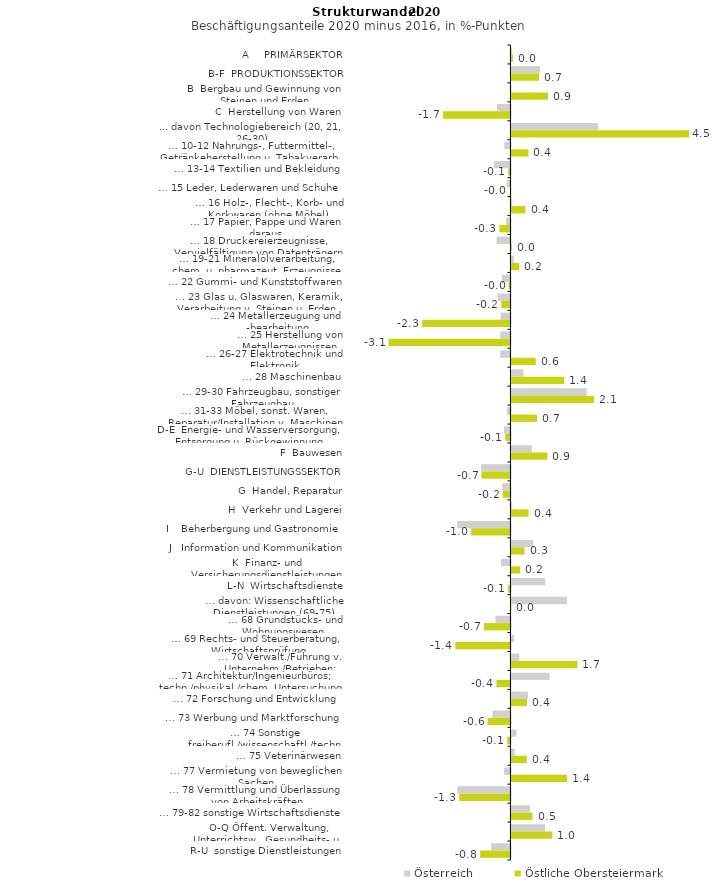
| Category | Österreich | Östliche Obersteiermark |
|---|---|---|
| A     PRIMÄRSEKTOR | 0.018 | 0.037 |
| B-F  PRODUKTIONSSEKTOR | 0.731 | 0.705 |
| B  Bergbau und Gewinnung von Steinen und Erden | -0.006 | 0.934 |
| C  Herstellung von Waren | -0.347 | -1.721 |
| ... davon Technologiebereich (20, 21, 26-30) | 2.213 | 4.542 |
| … 10-12 Nahrungs-, Futtermittel-, Getränkeherstellung u. Tabakverarb. | -0.156 | 0.435 |
| … 13-14 Textilien und Bekleidung | -0.417 | -0.057 |
| … 15 Leder, Lederwaren und Schuhe | -0.095 | 0 |
| … 16 Holz-, Flecht-, Korb- und Korkwaren (ohne Möbel)  | 0.023 | 0.359 |
| … 17 Papier, Pappe und Waren daraus  | -0.11 | -0.281 |
| … 18 Druckereierzeugnisse, Vervielfältigung von Datenträgern | -0.357 | 0.009 |
| … 19-21 Mineralölverarbeitung, chem. u. pharmazeut. Erzeugnisse | 0.063 | 0.2 |
| … 22 Gummi- und Kunststoffwaren | -0.217 | -0.047 |
| … 23 Glas u. Glaswaren, Keramik, Verarbeitung v. Steinen u. Erden  | -0.33 | -0.236 |
| … 24 Metallerzeugung und -bearbeitung | -0.251 | -2.257 |
| … 25 Herstellung von Metallerzeugnissen  | -0.261 | -3.117 |
| … 26-27 Elektrotechnik und Elektronik | -0.258 | 0.621 |
| … 28 Maschinenbau | 0.309 | 1.351 |
| … 29-30 Fahrzeugbau, sonstiger Fahrzeugbau | 1.924 | 2.109 |
| … 31-33 Möbel, sonst. Waren, Reparatur/Installation v. Maschinen | -0.089 | 0.655 |
| D-E  Energie- und Wasserversorgung, Entsorgung u. Rückgewinnung | -0.17 | -0.132 |
| F  Bauwesen | 0.522 | 0.919 |
| G-U  DIENSTLEISTUNGSSEKTOR | -0.749 | -0.74 |
| G  Handel, Reparatur | -0.208 | -0.198 |
| H  Verkehr und Lagerei | 0.02 | 0.436 |
| I    Beherbergung und Gastronomie | -1.357 | -1.004 |
| J   Information und Kommunikation | 0.559 | 0.335 |
| K  Finanz- und Versicherungsdienstleistungen | -0.241 | 0.223 |
| L-N  Wirtschaftsdienste | 0.862 | -0.063 |
| … davon: Wissenschaftliche Dienstleistungen (69-75) | 1.424 | 0.001 |
| … 68 Grundstücks- und Wohnungswesen  | -0.382 | -0.675 |
| … 69 Rechts- und Steuerberatung, Wirtschaftsprüfung | 0.071 | -1.411 |
| … 70 Verwalt./Führung v. Unternehm./Betrieben; Unternehmensberat. | 0.205 | 1.688 |
| … 71 Architektur/Ingenieurbüros; techn./physikal./chem. Untersuchung | 0.976 | -0.358 |
| … 72 Forschung und Entwicklung  | 0.423 | 0.397 |
| … 73 Werbung und Marktforschung | -0.459 | -0.584 |
| … 74 Sonstige freiberufl./wissenschaftl./techn. Tätigkeiten | 0.13 | -0.083 |
| … 75 Veterinärwesen | 0.078 | 0.393 |
| … 77 Vermietung von beweglichen Sachen  | -0.163 | 1.423 |
| … 78 Vermittlung und Überlassung von Arbeitskräften | -1.357 | -1.308 |
| … 79-82 sonstige Wirtschaftsdienste | 0.479 | 0.539 |
| O-Q Öffent. Verwaltung, Unterrichtsw., Gesundheits- u. Sozialwesen | 0.859 | 1.045 |
| R-U  sonstige Dienstleistungen | -0.495 | -0.774 |